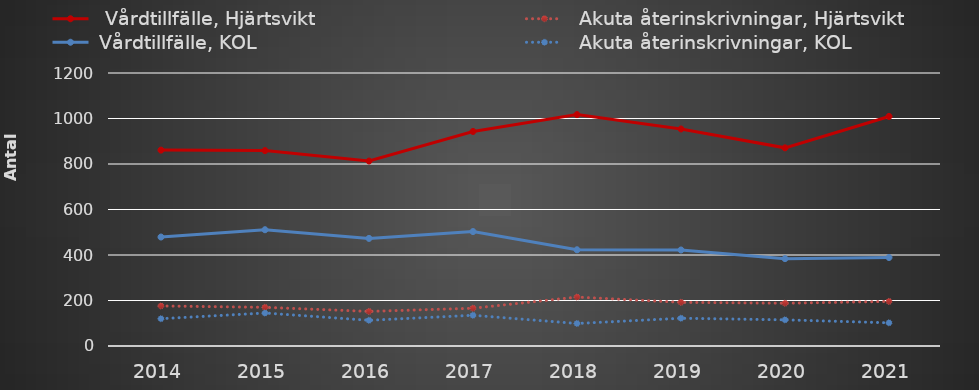
| Category |   Vårdtillfälle, Hjärtsvikt |   Akuta återinskrivningar, Hjärtsvikt |  Vårdtillfälle, KOL |   Akuta återinskrivningar, KOL |
|---|---|---|---|---|
| 2014 | 861 | 176 | 479 | 120 |
| 2015 | 859 | 170 | 511 | 145 |
| 2016 | 813 | 152 | 473 | 113 |
| 2017 | 943 | 166 | 503 | 135 |
| 2018 | 1017 | 215 | 423 | 99 |
| 2019 | 954 | 192 | 422 | 122 |
| 2020 | 871 | 188 | 384 | 115 |
| 2021 | 1009 | 196 | 389 | 102 |